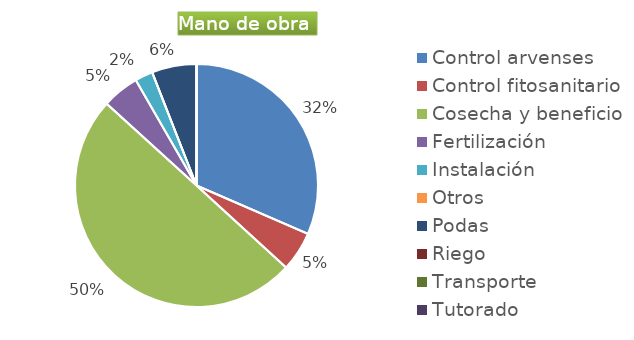
| Category | Series 0 |
|---|---|
| Control arvenses | 55397194 |
| Control fitosanitario | 9281250 |
| Cosecha y beneficio | 87801120 |
| Fertilización | 8662500 |
| Instalación | 4175417 |
| Otros | 0 |
| Podas | 10450000 |
| Riego | 0 |
| Transporte | 0 |
| Tutorado | 0 |